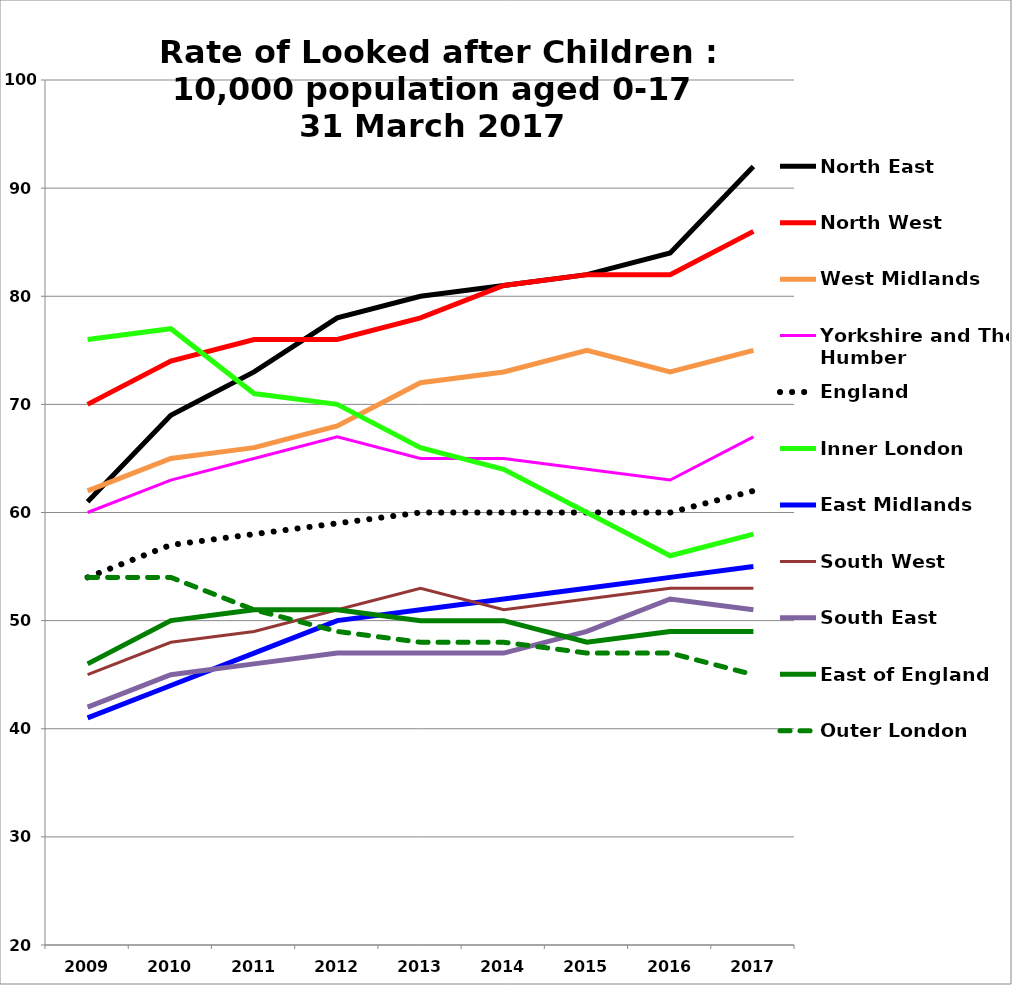
| Category | North East | North West                              | West Midlands | Yorkshire and The Humber | England | Inner London | East Midlands | South West | South East | East of England | Outer London |
|---|---|---|---|---|---|---|---|---|---|---|---|
| 2009.0 | 61 | 70 | 62 | 60 | 54 | 76 | 41 | 45 | 42 | 46 | 54 |
| 2010.0 | 69 | 74 | 65 | 63 | 57 | 77 | 44 | 48 | 45 | 50 | 54 |
| 2011.0 | 73 | 76 | 66 | 65 | 58 | 71 | 47 | 49 | 46 | 51 | 51 |
| 2012.0 | 78 | 76 | 68 | 67 | 59 | 70 | 50 | 51 | 47 | 51 | 49 |
| 2013.0 | 80 | 78 | 72 | 65 | 60 | 66 | 51 | 53 | 47 | 50 | 48 |
| 2014.0 | 81 | 81 | 73 | 65 | 60 | 64 | 52 | 51 | 47 | 50 | 48 |
| 2015.0 | 82 | 82 | 75 | 64 | 60 | 60 | 53 | 52 | 49 | 48 | 47 |
| 2016.0 | 84 | 82 | 73 | 63 | 60 | 56 | 54 | 53 | 52 | 49 | 47 |
| 2017.0 | 92 | 86 | 75 | 67 | 62 | 58 | 55 | 53 | 51 | 49 | 45 |